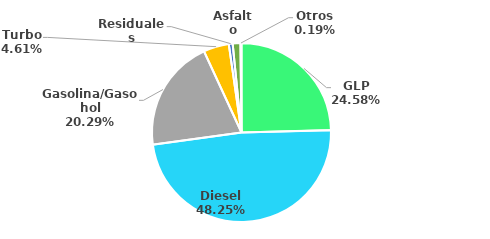
| Category | MBPD |
|---|---|
| GLP | 64.181 |
| Diesel | 125.982 |
| Gasolina/Gasohol | 52.982 |
| Turbo | 12.026 |
| Residuales | 1.823 |
| Asfalto | 3.643 |
| Otros | 0.485 |